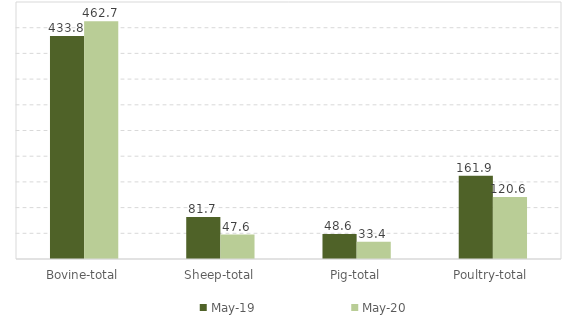
| Category | May-19 | May-20 |
|---|---|---|
| Bovine-total | 433.8 | 462.7 |
| Sheep-total | 81.7 | 47.6 |
| Pig-total | 48.6 | 33.4 |
| Poultry-total | 161.9 | 120.6 |